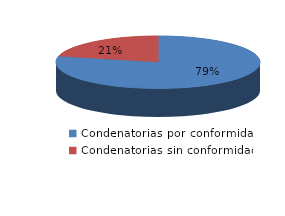
| Category | Series 0 |
|---|---|
| 0 | 37 |
| 1 | 10 |